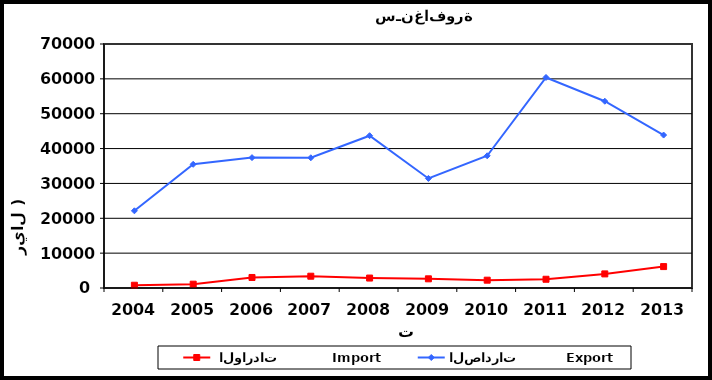
| Category |  الواردات           Import | الصادرات          Export |
|---|---|---|
| 2004.0 | 791 | 22147 |
| 2005.0 | 1094 | 35488 |
| 2006.0 | 3020 | 37405 |
| 2007.0 | 3381 | 37360 |
| 2008.0 | 2854 | 43693 |
| 2009.0 | 2635 | 31429 |
| 2010.0 | 2242 | 37931 |
| 2011.0 | 2506 | 60398 |
| 2012.0 | 4044 | 53582 |
| 2013.0 | 6142 | 43876 |